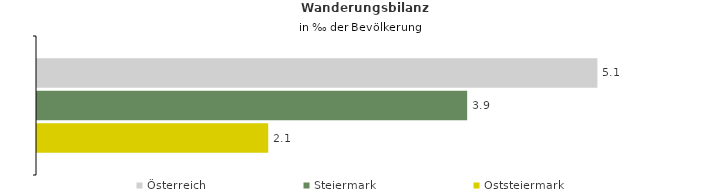
| Category | Österreich | Steiermark | Oststeiermark |
|---|---|---|---|
| Wanderungsrate in ‰ der Bevölkerung, Periode 2016-2020 | 5.087 | 3.905 | 2.099 |